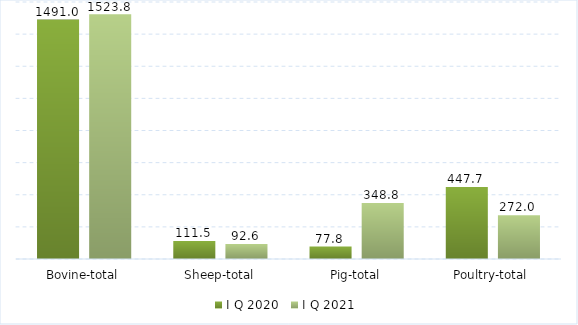
| Category | I Q 2020 | I Q 2021 |
|---|---|---|
| Bovine-total | 1491 | 1523.8 |
| Sheep-total | 111.5 | 92.619 |
| Pig-total | 77.8 | 348.838 |
| Poultry-total | 447.7 | 271.951 |